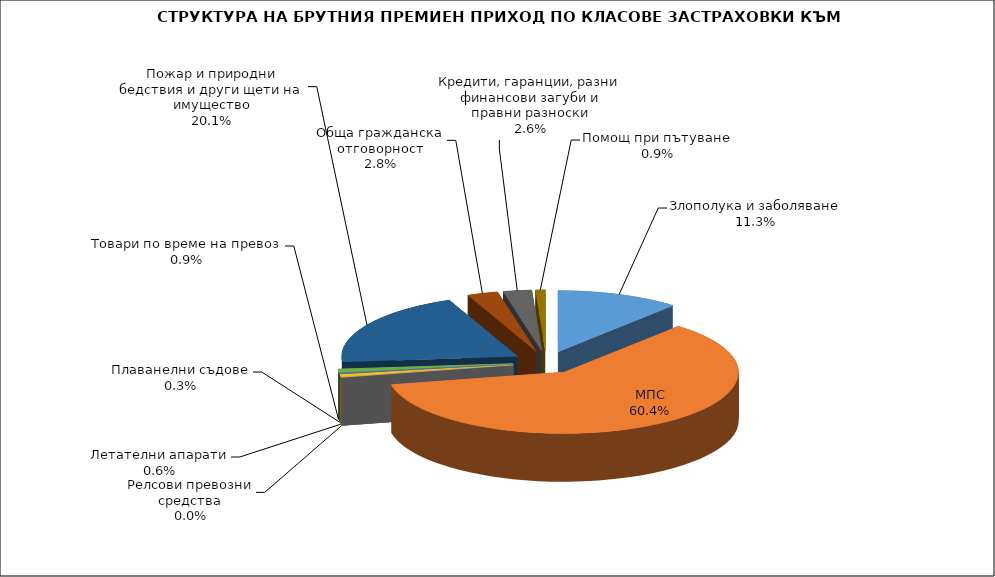
| Category | Злополука и заболяване МПС Релсови превозни средства Летателни апарати Плаванелни съдове Товари по време на превоз Пожар и природни бедствия и други щети на имущество Обща гражданска отговорност Кредити, гаранции, разни финансови загуби и правни разноски  |
|---|---|
| Злополука и заболяване | 0.113 |
| МПС | 0.604 |
| Релсови превозни средства | 0 |
| Летателни апарати | 0.006 |
| Плаванелни съдове | 0.003 |
| Товари по време на превоз | 0.009 |
| Пожар и природни бедствия и други щети на имущество | 0.201 |
| Обща гражданска отговорност | 0.028 |
| Кредити, гаранции, разни финансови загуби и правни разноски | 0.026 |
| Помощ при пътуване | 0.009 |